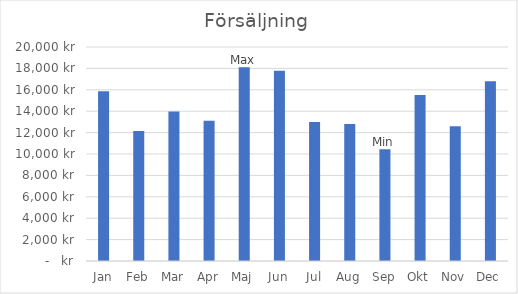
| Category | Försäljning |
|---|---|
| Jan | 15875 |
| Feb | 12141 |
| Mar | 13980 |
| Apr | 13116 |
| Maj | 18110 |
| Jun | 17773 |
| Jul | 12998 |
| Aug | 12800 |
| Sep | 10443 |
| Okt | 15520 |
| Nov | 12604 |
| Dec | 16806 |